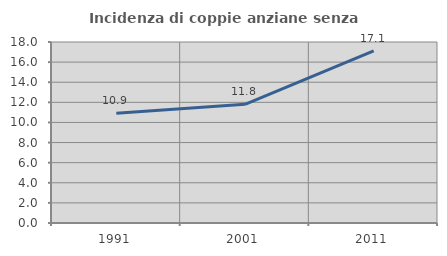
| Category | Incidenza di coppie anziane senza figli  |
|---|---|
| 1991.0 | 10.909 |
| 2001.0 | 11.806 |
| 2011.0 | 17.126 |